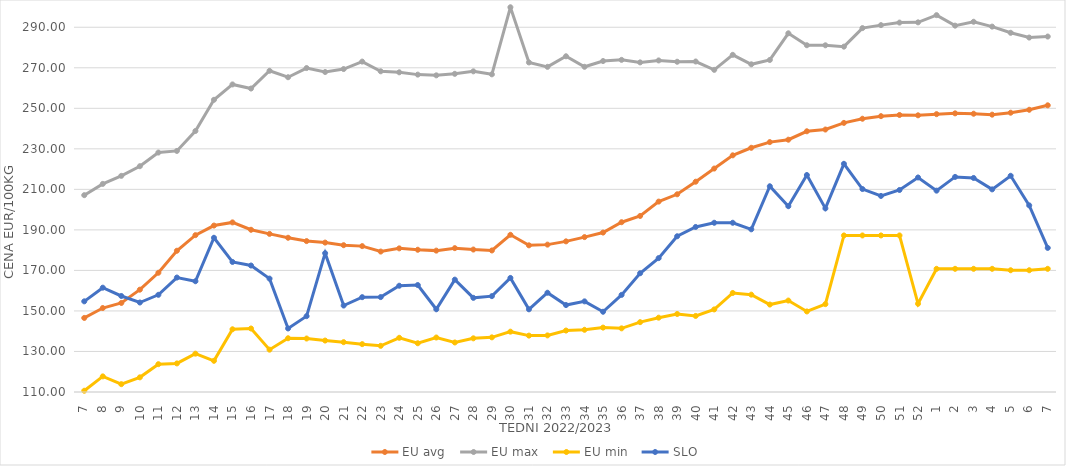
| Category | EU avg | EU max | EU min | SLO |
|---|---|---|---|---|
| 7.0 | 146.556 | 207.14 | 110.619 | 154.74 |
| 8.0 | 151.439 | 212.7 | 117.709 | 161.48 |
| 9.0 | 153.947 | 216.67 | 113.871 | 157.38 |
| 10.0 | 160.496 | 221.43 | 117.233 | 154.16 |
| 11.0 | 168.845 | 228.17 | 123.737 | 157.96 |
| 12.0 | 179.714 | 228.97 | 124.105 | 166.49 |
| 13.0 | 187.409 | 238.81 | 128.918 | 164.66 |
| 14.0 | 192.137 | 254.21 | 125.399 | 186.11 |
| 15.0 | 193.697 | 261.79 | 140.954 | 174.18 |
| 16.0 | 190.066 | 259.76 | 141.337 | 172.42 |
| 17.0 | 188.031 | 268.52 | 130.897 | 165.96 |
| 18.0 | 186.119 | 265.34 | 136.529 | 141.36 |
| 19.0 | 184.47 | 269.87 | 136.387 | 147.43 |
| 20.0 | 183.734 | 267.92 | 135.392 | 178.51 |
| 21.0 | 182.45 | 269.38 | 134.589 | 152.67 |
| 22.0 | 181.991 | 273.06 | 133.621 | 156.8 |
| 23.0 | 179.308 | 268.27 | 132.787 | 156.84 |
| 24.0 | 180.886 | 267.77 | 136.75 | 162.44 |
| 25.0 | 180.2 | 266.63 | 134.058 | 162.78 |
| 26.0 | 179.77 | 266.27 | 136.895 | 150.82 |
| 27.0 | 180.992 | 267.02 | 134.44 | 165.45 |
| 28.0 | 180.305 | 268.25 | 136.486 | 156.46 |
| 29.0 | 179.847 | 266.77 | 136.97 | 157.31 |
| 30.0 | 187.576 | 299.87 | 139.777 | 166.29 |
| 31.0 | 182.385 | 272.64 | 137.828 | 150.81 |
| 32.0 | 182.73 | 270.47 | 137.934 | 158.99 |
| 33.0 | 184.343 | 275.68 | 140.33 | 152.91 |
| 34.0 | 186.448 | 270.49 | 140.7 | 154.73 |
| 35.0 | 188.684 | 273.33 | 141.78 | 149.6 |
| 36.0 | 193.792 | 273.91 | 141.41 | 157.93 |
| 37.0 | 196.877 | 272.67 | 144.47 | 168.61 |
| 38.0 | 203.962 | 273.63 | 146.68 | 176.07 |
| 39.0 | 207.574 | 272.98 | 148.499 | 186.86 |
| 40.0 | 213.785 | 273.1 | 147.54 | 191.45 |
| 41.0 | 220.272 | 268.98 | 150.75 | 193.52 |
| 42.0 | 226.803 | 276.39 | 158.87 | 193.52 |
| 43.0 | 230.521 | 271.72 | 158.04 | 190.28 |
| 44.0 | 233.325 | 273.856 | 153.16 | 211.53 |
| 45.0 | 234.517 | 287.021 | 155.13 | 201.69 |
| 46.0 | 238.669 | 281.133 | 149.75 | 217.08 |
| 47.0 | 239.534 | 281.102 | 153.36 | 200.62 |
| 48.0 | 242.81 | 280.434 | 187.26 | 222.61 |
| 49.0 | 244.854 | 289.585 | 187.26 | 210.16 |
| 50.0 | 246.132 | 291.057 | 187.26 | 206.76 |
| 51.0 | 246.705 | 292.307 | 187.26 | 209.69 |
| 52.0 | 246.546 | 292.426 | 153.54 | 215.87 |
| 1.0 | 247.118 | 295.98 | 170.79 | 209.37 |
| 2.0 | 247.516 | 290.8 | 170.79 | 216.15 |
| 3.0 | 247.327 | 292.71 | 170.79 | 215.63 |
| 4.0 | 246.864 | 290.32 | 170.79 | 210 |
| 5.0 | 247.83 | 287.27 | 170.09 | 216.7 |
| 6.0 | 249.278 | 284.92 | 170.09 | 202.1 |
| 7.0 | 251.483 | 285.42 | 170.79 | 181.11 |